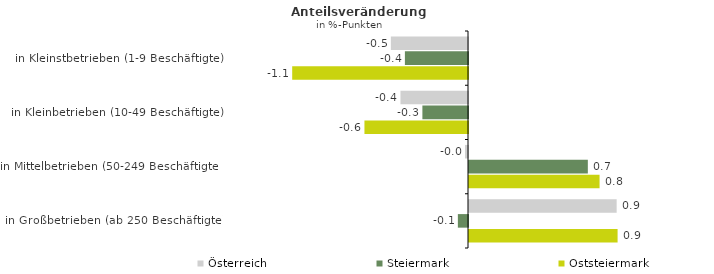
| Category | Österreich | Steiermark | Oststeiermark |
|---|---|---|---|
| in Kleinstbetrieben (1-9 Beschäftigte) | -0.48 | -0.393 | -1.094 |
| in Kleinbetrieben (10-49 Beschäftigte) | -0.42 | -0.284 | -0.645 |
| in Mittelbetrieben (50-249 Beschäftigte) | -0.019 | 0.74 | 0.813 |
| in Großbetrieben (ab 250 Beschäftigte) | 0.919 | -0.063 | 0.925 |